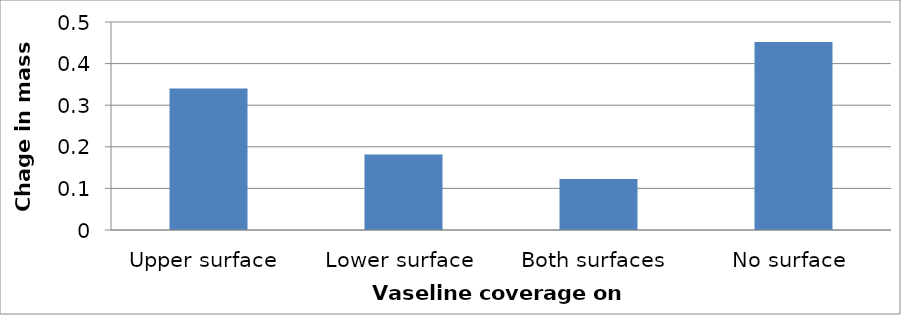
| Category | Series 0 |
|---|---|
| Upper surface | 0.34 |
| Lower surface | 0.182 |
| Both surfaces | 0.123 |
| No surface | 0.452 |